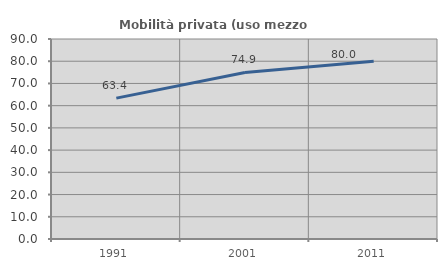
| Category | Mobilità privata (uso mezzo privato) |
|---|---|
| 1991.0 | 63.406 |
| 2001.0 | 74.928 |
| 2011.0 | 80 |